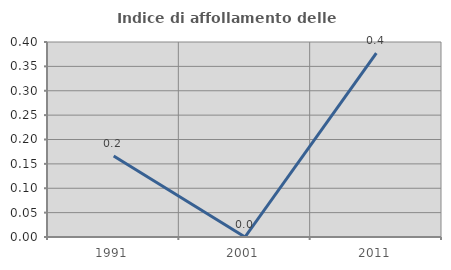
| Category | Indice di affollamento delle abitazioni  |
|---|---|
| 1991.0 | 0.166 |
| 2001.0 | 0 |
| 2011.0 | 0.377 |